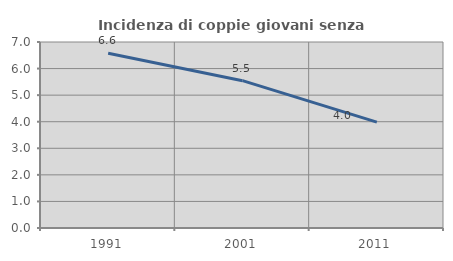
| Category | Incidenza di coppie giovani senza figli |
|---|---|
| 1991.0 | 6.575 |
| 2001.0 | 5.544 |
| 2011.0 | 3.982 |